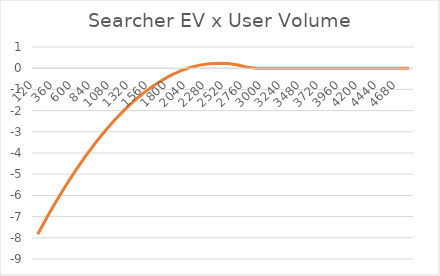
| Category | Searcher EV / User Volume  x Pool Fee |
|---|---|
| 120.0 | -7.836 |
| 240.0 | -7.012 |
| 360.0 | -6.233 |
| 480.0 | -5.497 |
| 600.0 | -4.806 |
| 720.0 | -4.159 |
| 840.0 | -3.556 |
| 960.0 | -2.997 |
| 1080.0 | -2.483 |
| 1200.0 | -2.013 |
| 1320.0 | -1.587 |
| 1440.0 | -1.206 |
| 1560.0 | -0.869 |
| 1680.0 | -0.577 |
| 1800.0 | -0.329 |
| 1920.0 | -0.126 |
| 2040.0 | 0.032 |
| 2160.0 | 0.146 |
| 2280.0 | 0.215 |
| 2400.0 | 0.239 |
| 2520.0 | 0.218 |
| 2640.0 | 0.153 |
| 2760.0 | 0.042 |
| 2880.0 | 0 |
| 3000.0 | 0 |
| 3120.0 | 0 |
| 3240.0 | 0 |
| 3360.0 | 0 |
| 3480.0 | 0 |
| 3600.0 | 0 |
| 3720.0 | 0 |
| 3840.0 | 0 |
| 3960.0 | 0 |
| 4080.0 | 0 |
| 4200.0 | 0 |
| 4320.0 | 0 |
| 4440.0 | 0 |
| 4560.0 | 0 |
| 4680.0 | 0 |
| 4800.0 | 0 |